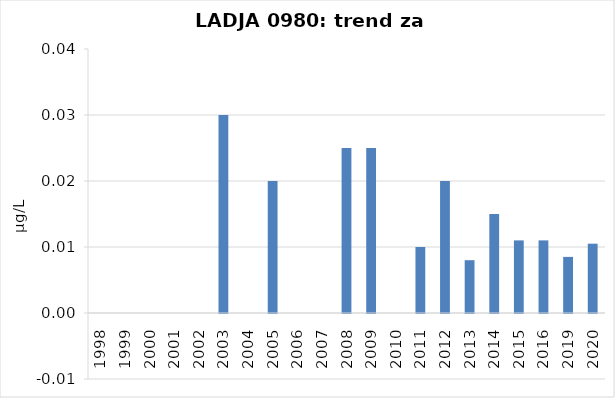
| Category | Vsota |
|---|---|
| 1998 | 0 |
| 1999 | 0 |
| 2000 | 0 |
| 2001 | 0 |
| 2002 | 0 |
| 2003 | 0.03 |
| 2004 | 0 |
| 2005 | 0.02 |
| 2006 | 0 |
| 2007 | 0 |
| 2008 | 0.025 |
| 2009 | 0.025 |
| 2010 | 0 |
| 2011 | 0.01 |
| 2012 | 0.02 |
| 2013 | 0.008 |
| 2014 | 0.015 |
| 2015 | 0.011 |
| 2016 | 0.011 |
| 2019 | 0.008 |
| 2020 | 0.01 |